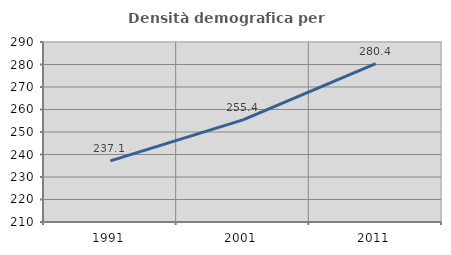
| Category | Densità demografica |
|---|---|
| 1991.0 | 237.139 |
| 2001.0 | 255.383 |
| 2011.0 | 280.411 |